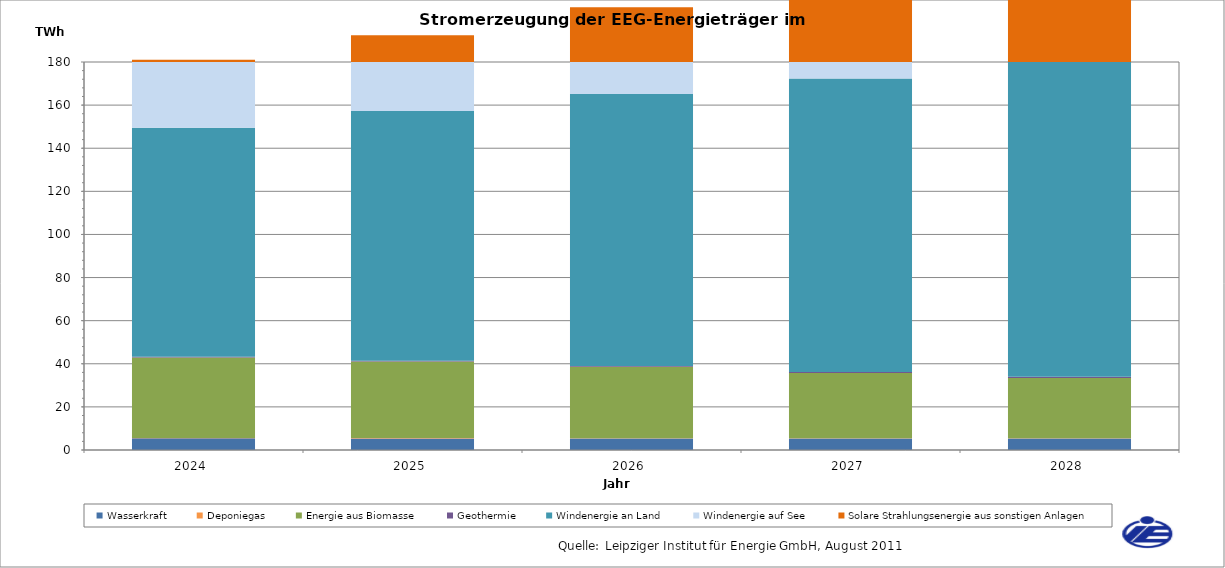
| Category | Wasserkraft | Deponiegas | Energie aus Biomasse | Geothermie | Windenergie an Land | Windenergie auf See | Solare Strahlungsenergie aus sonstigen Anlagen |
|---|---|---|---|---|---|---|---|
| 2024.0 | 5395.092 | 174.603 | 37386.628 | 289.392 | 106290.322 | 31521.22 | 46139.937 |
| 2025.0 | 5389.05 | 134.807 | 35537.408 | 339.173 | 115839.675 | 35161.027 | 52531.387 |
| 2026.0 | 5383.008 | 97.161 | 33123.691 | 396.421 | 126133.111 | 40284.358 | 59242.321 |
| 2027.0 | 5376.966 | 87.09 | 30266.099 | 462.256 | 136141.358 | 45585.057 | 66264.423 |
| 2028.0 | 5370.924 | 80.065 | 27969.243 | 535.077 | 146703.245 | 52150.848 | 73462.771 |